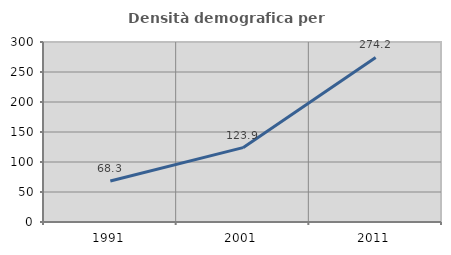
| Category | Densità demografica |
|---|---|
| 1991.0 | 68.302 |
| 2001.0 | 123.933 |
| 2011.0 | 274.198 |